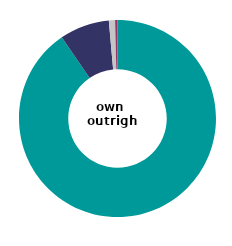
| Category | own 
outright |
|---|---|
| very satisfied | 90.434 |
| fairly satisfied | 8.159 |
| neither satisfied nor dissatisfied | 1.019 |
| slightly or very dissatisfied | 0.389 |